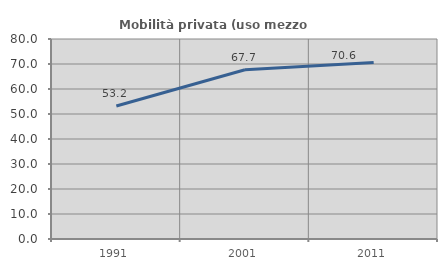
| Category | Mobilità privata (uso mezzo privato) |
|---|---|
| 1991.0 | 53.204 |
| 2001.0 | 67.675 |
| 2011.0 | 70.57 |